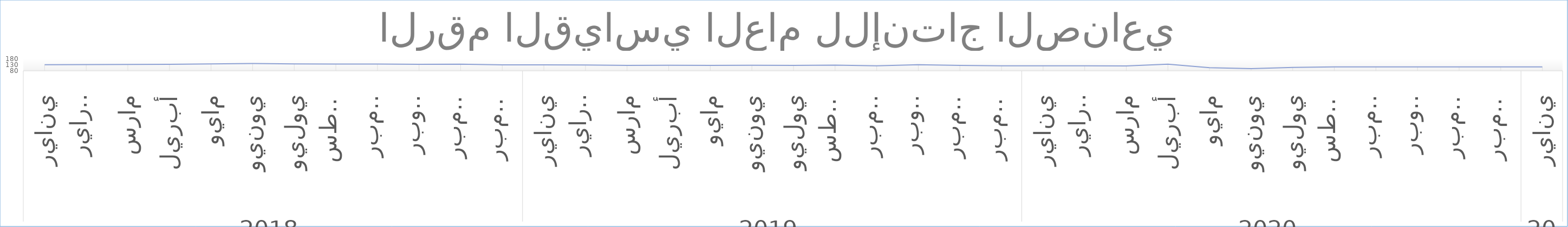
| Category | Series 0 | Series 1 |
|---|---|---|
| 0 |  | 131.554 |
| 1 |  | 131.978 |
| 2 |  | 133.541 |
| 3 |  | 134.948 |
| 4 |  | 137.543 |
| 5 |  | 141.109 |
| 6 |  | 137.87 |
| 7 |  | 137.31 |
| 8 |  | 137.024 |
| 9 |  | 134 |
| 10 |  | 136.149 |
| 11 |  | 130.141 |
| 12 |  | 130.427 |
| 13 |  | 129.292 |
| 14 |  | 125.577 |
| 15 |  | 126.337 |
| 16 |  | 125.162 |
| 17 |  | 126.607 |
| 18 |  | 125.321 |
| 19 |  | 127.328 |
| 20 |  | 121.554 |
| 21 |  | 130.713 |
| 22 |  | 125.115 |
| 23 |  | 121.882 |
| 24 |  | 121.717 |
| 25 |  | 121.895 |
| 26 |  | 121.451 |
| 27 |  | 135.238 |
| 28 |  | 105.732 |
| 29 |  | 98.453 |
| 30 |  | 108.518 |
| 31 |  | 112.576 |
| 32 |  | 112.408 |
| 33 |  | 113.06 |
| 34 |  | 112.598 |
| 35 |  | 112.623 |
| 36 |  | 113.334 |